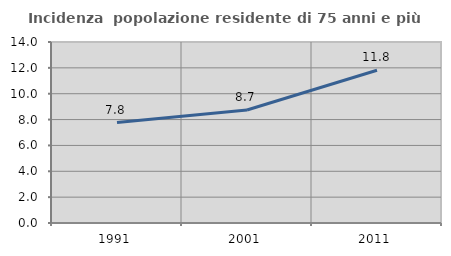
| Category | Incidenza  popolazione residente di 75 anni e più |
|---|---|
| 1991.0 | 7.767 |
| 2001.0 | 8.737 |
| 2011.0 | 11.817 |